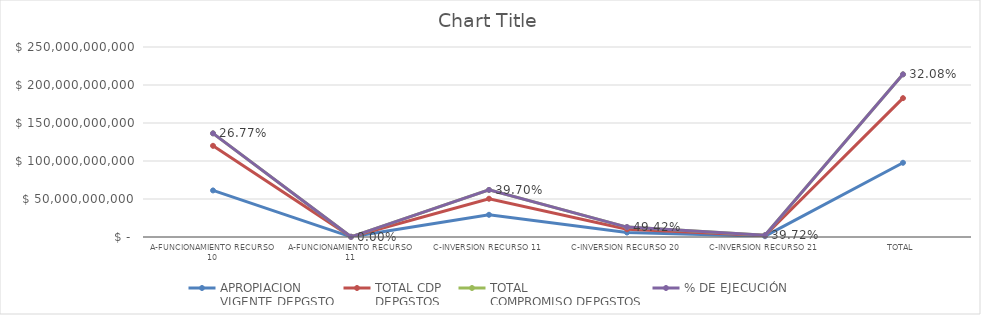
| Category | APROPIACION
VIGENTE DEPGSTO | TOTAL CDP
DEPGSTOS | TOTAL
COMPROMISO DEPGSTOS | % DE EJECUCIÓN |
|---|---|---|---|---|
| A-FUNCIONAMIENTO RECURSO 10 | 61276091000 | 58704826501.83 | 16406604662.4 | 0.268 |
| A-FUNCIONAMIENTO RECURSO 11 | 244200000 | 0 | 0 | 0 |
| C-INVERSION RECURSO 11 | 29225074635 | 21138134401 | 11603393970 | 0.397 |
| C-INVERSION RECURSO 20 | 5882000000 | 4264878776 | 2907138974 | 0.494 |
| C-INVERSION RECURSO 21 | 1053910847 | 904585100 | 418596000 | 0.397 |
| TOTAL | 97681276482 | 85012424778.83 | 31335733606.4 | 0.321 |